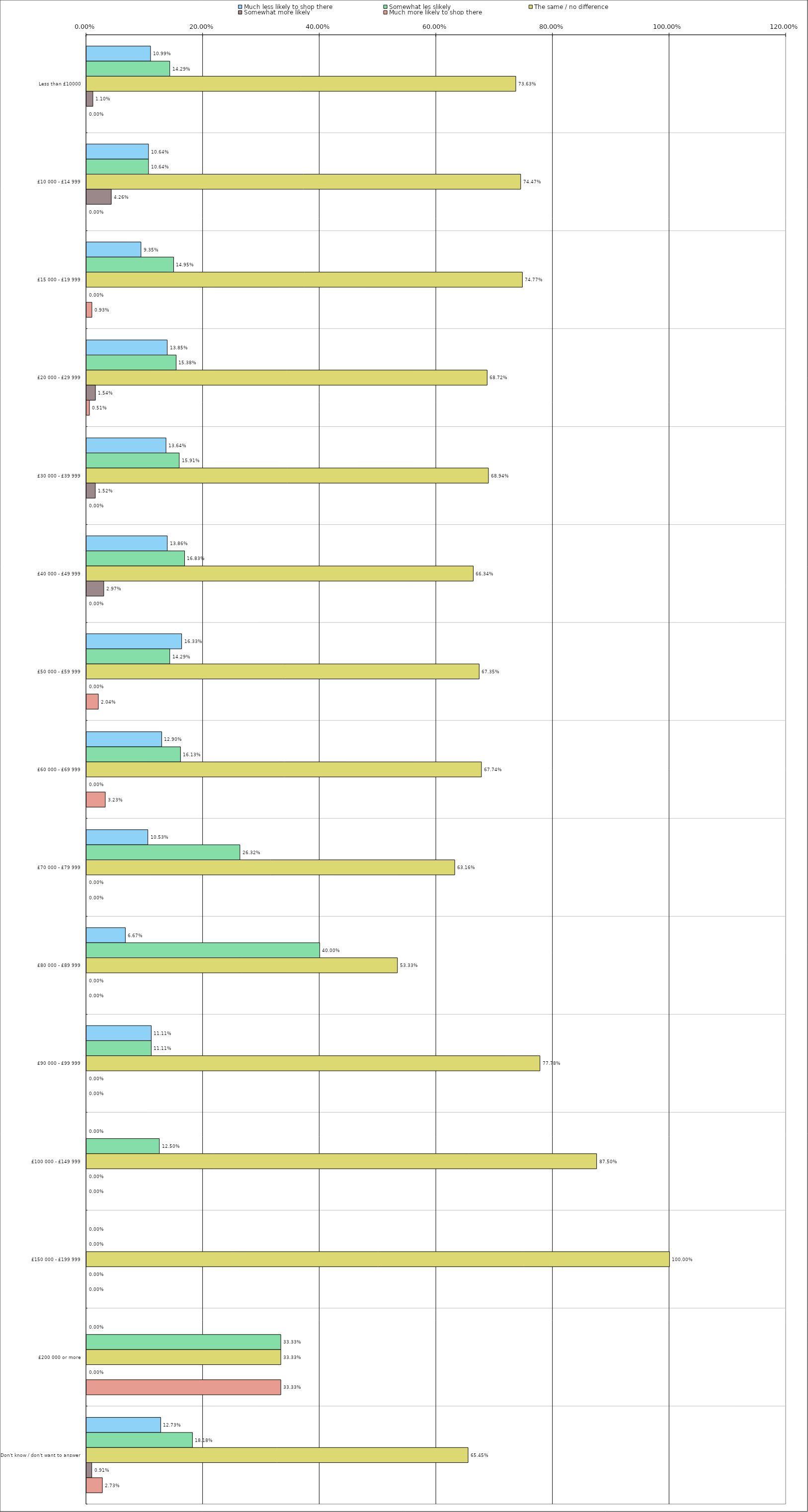
| Category | Much less likely to shop there | Somewhat les slikely | The same / no difference | Somewhat more likely | Much more likely to shop there |
|---|---|---|---|---|---|
| 0 | 0.11 | 0.143 | 0.736 | 0.011 | 0 |
| 1 | 0.106 | 0.106 | 0.745 | 0.043 | 0 |
| 2 | 0.094 | 0.15 | 0.748 | 0 | 0.009 |
| 3 | 0.138 | 0.154 | 0.687 | 0.015 | 0.005 |
| 4 | 0.136 | 0.159 | 0.689 | 0.015 | 0 |
| 5 | 0.139 | 0.168 | 0.663 | 0.03 | 0 |
| 6 | 0.163 | 0.143 | 0.674 | 0 | 0.02 |
| 7 | 0.129 | 0.161 | 0.677 | 0 | 0.032 |
| 8 | 0.105 | 0.263 | 0.632 | 0 | 0 |
| 9 | 0.067 | 0.4 | 0.533 | 0 | 0 |
| 10 | 0.111 | 0.111 | 0.778 | 0 | 0 |
| 11 | 0 | 0.125 | 0.875 | 0 | 0 |
| 12 | 0 | 0 | 1 | 0 | 0 |
| 13 | 0 | 0.333 | 0.333 | 0 | 0.333 |
| 14 | 0.127 | 0.182 | 0.654 | 0.009 | 0.027 |